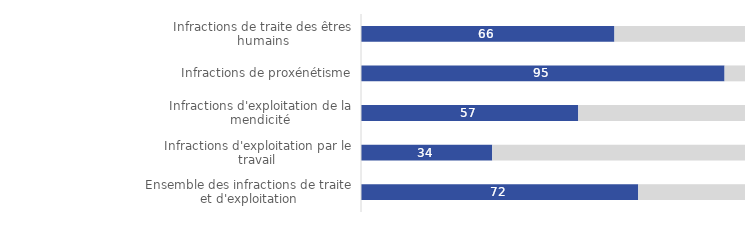
| Category | Series 0 | Series 1 |
|---|---|---|
| Infractions de traite des êtres humains | 66 | 34 |
| Infractions de proxénétisme | 94.68 | 5.32 |
| Infractions d'exploitation de la mendicité | 56.579 | 43.421 |
| Infractions d'exploitation par le travail | 34.174 | 65.826 |
| Ensemble des infractions de traite et d'exploitation | 72.191 | 27.809 |